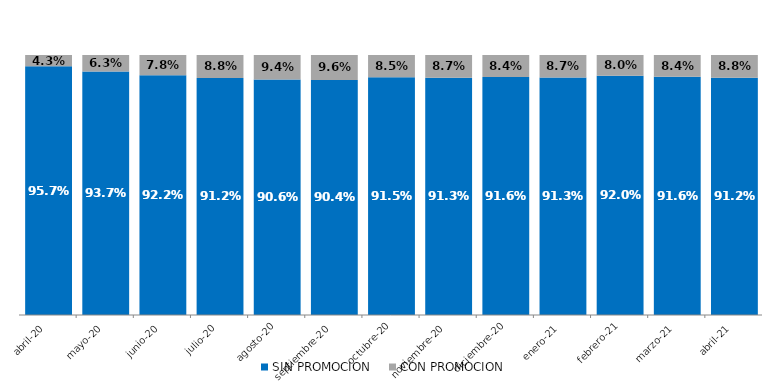
| Category | SIN PROMOCION   | CON PROMOCION   |
|---|---|---|
| 2020-04-01 | 0.957 | 0.043 |
| 2020-05-01 | 0.937 | 0.063 |
| 2020-06-01 | 0.922 | 0.078 |
| 2020-07-01 | 0.912 | 0.088 |
| 2020-08-01 | 0.906 | 0.094 |
| 2020-09-01 | 0.904 | 0.096 |
| 2020-10-01 | 0.915 | 0.085 |
| 2020-11-01 | 0.913 | 0.087 |
| 2020-12-01 | 0.916 | 0.084 |
| 2021-01-01 | 0.913 | 0.087 |
| 2021-02-01 | 0.92 | 0.08 |
| 2021-03-01 | 0.916 | 0.084 |
| 2021-04-01 | 0.912 | 0.088 |